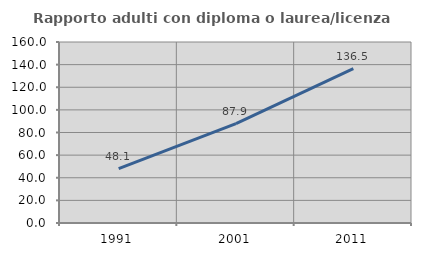
| Category | Rapporto adulti con diploma o laurea/licenza media  |
|---|---|
| 1991.0 | 48.125 |
| 2001.0 | 87.85 |
| 2011.0 | 136.454 |